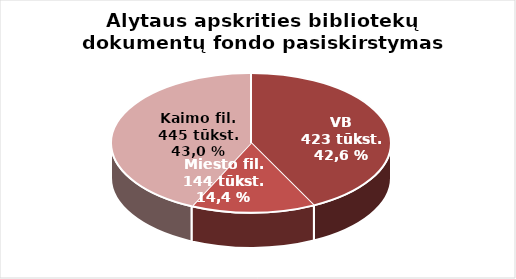
| Category | Series 0 |
|---|---|
| VB | 423509 |
| Miesto filialuose | 142828 |
| Kaimo filialuose | 428132 |